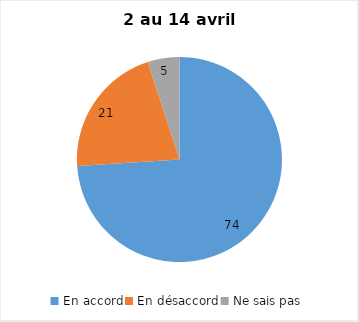
| Category | Series 0 |
|---|---|
| En accord | 74 |
| En désaccord | 21 |
| Ne sais pas | 5 |